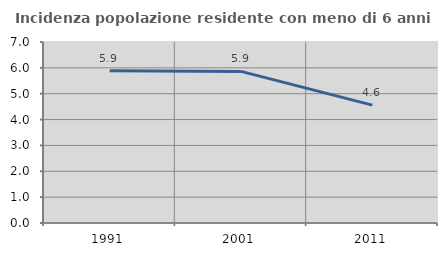
| Category | Incidenza popolazione residente con meno di 6 anni |
|---|---|
| 1991.0 | 5.893 |
| 2001.0 | 5.863 |
| 2011.0 | 4.56 |